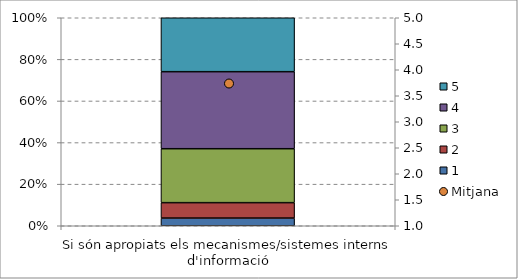
| Category | 1 | 2 | 3 | 4 | 5 |
|---|---|---|---|---|---|
| Si són apropiats els mecanismes/sistemes interns d'informació | 0.037 | 0.074 | 0.259 | 0.37 | 0.259 |